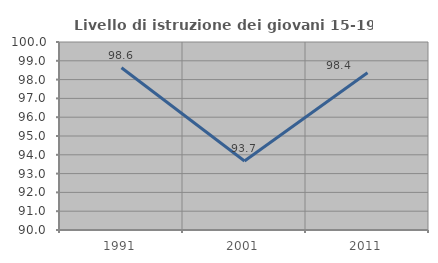
| Category | Livello di istruzione dei giovani 15-19 anni |
|---|---|
| 1991.0 | 98.63 |
| 2001.0 | 93.671 |
| 2011.0 | 98.361 |